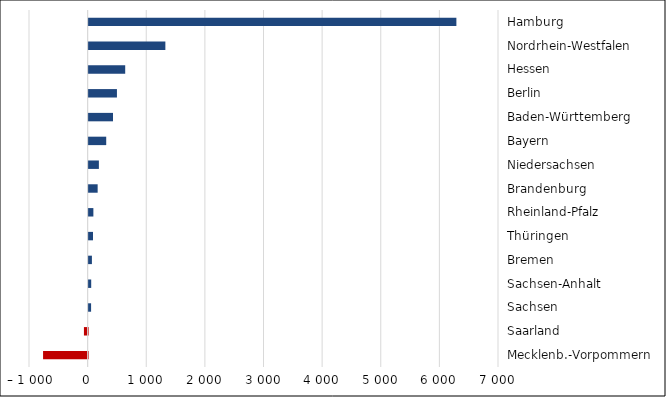
| Category | Series 0 |
|---|---|
| Mecklenb.-Vorpommern | -760 |
| Saarland | -63 |
| Sachsen | 42 |
| Sachsen-Anhalt | 44 |
| Bremen | 56 |
| Thüringen | 75 |
| Rheinland-Pfalz | 81 |
| Brandenburg | 154 |
| Niedersachsen | 175 |
| Bayern | 300 |
| Baden-Württemberg | 416 |
| Berlin | 483 |
| Hessen | 624 |
| Nordrhein-Westfalen | 1309 |
| Hamburg | 6273 |